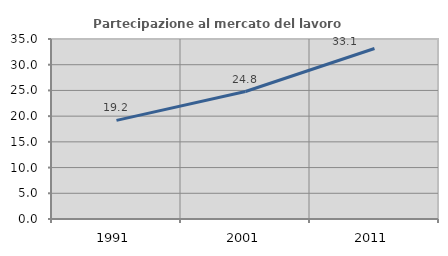
| Category | Partecipazione al mercato del lavoro  femminile |
|---|---|
| 1991.0 | 19.178 |
| 2001.0 | 24.784 |
| 2011.0 | 33.148 |